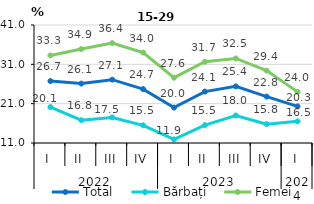
| Category | Total | Bărbați | Femei |
|---|---|---|---|
| 0 | 26.744 | 20.142 | 33.259 |
| 1 | 26.1 | 16.8 | 34.9 |
| 2 | 27.1 | 17.5 | 36.4 |
| 3 | 24.7 | 15.5 | 34 |
| 4 | 20 | 11.9 | 27.6 |
| 5 | 24.074 | 15.537 | 31.654 |
| 6 | 25.4 | 18 | 32.5 |
| 7 | 22.8 | 15.8 | 29.4 |
| 8 | 20.3 | 16.5 | 24 |